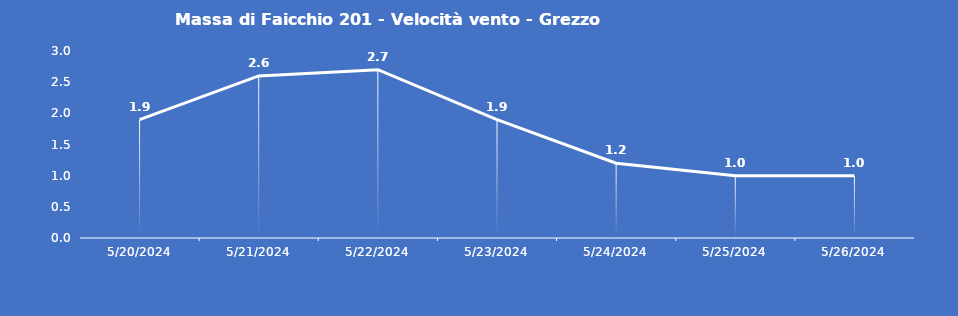
| Category | Massa di Faicchio 201 - Velocità vento - Grezzo (m/s) |
|---|---|
| 5/20/24 | 1.9 |
| 5/21/24 | 2.6 |
| 5/22/24 | 2.7 |
| 5/23/24 | 1.9 |
| 5/24/24 | 1.2 |
| 5/25/24 | 1 |
| 5/26/24 | 1 |